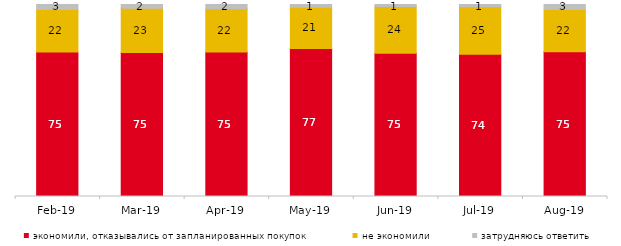
| Category | экономили, отказывались от запланированных покупок | не экономили | затрудняюсь ответить |
|---|---|---|---|
| 2019-02-01 | 75.2 | 22.2 | 2.6 |
| 2019-03-01 | 75.037 | 23.023 | 1.939 |
| 2019-04-01 | 75.297 | 22.426 | 2.277 |
| 2019-05-01 | 77.068 | 21.496 | 1.436 |
| 2019-06-01 | 74.663 | 24.239 | 1.097 |
| 2019-07-01 | 74.109 | 24.752 | 1.139 |
| 2019-08-01 | 75.425 | 21.978 | 2.597 |